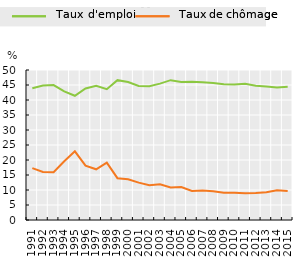
| Category | Taux d'emploi | Taux de chômage |
|---|---|---|
| 1991.0 | 43.914 | 17.3 |
| 1992.0 | 44.804 | 16 |
| 1993.0 | 44.995 | 15.9 |
| 1994.0 | 42.894 | 19.575 |
| 1995.0 | 41.419 | 22.9 |
| 1996.0 | 43.862 | 18.1 |
| 1997.0 | 44.761 | 16.9 |
| 1998.0 | 43.604 | 19.12 |
| 1999.0 | 46.617 | 13.94 |
| 2000.0 | 45.969 | 13.6 |
| 2001.0 | 44.691 | 12.46 |
| 2002.0 | 44.615 | 11.59 |
| 2003.0 | 45.458 | 11.92 |
| 2004.0 | 46.611 | 10.83 |
| 2005.0 | 45.968 | 11.01 |
| 2006.0 | 46.075 | 9.67 |
| 2007.0 | 45.881 | 9.8 |
| 2008.0 | 45.683 | 9.6 |
| 2009.0 | 45.279 | 9.1 |
| 2010.0 | 45.144 | 9.1 |
| 2011.0 | 45.41 | 8.91 |
| 2012.0 | 44.78 | 8.99 |
| 2013.0 | 44.491 | 9.23 |
| 2014.0 | 44.204 | 9.9 |
| 2015.0 | 44.433 | 9.7 |